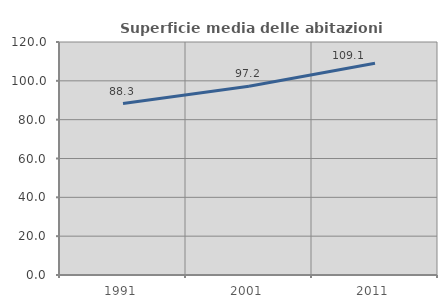
| Category | Superficie media delle abitazioni occupate |
|---|---|
| 1991.0 | 88.307 |
| 2001.0 | 97.221 |
| 2011.0 | 109.095 |